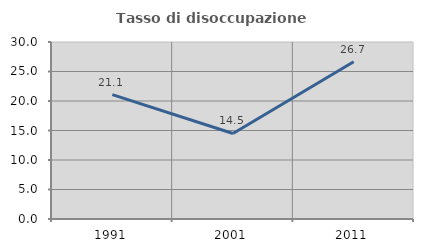
| Category | Tasso di disoccupazione giovanile  |
|---|---|
| 1991.0 | 21.084 |
| 2001.0 | 14.493 |
| 2011.0 | 26.667 |